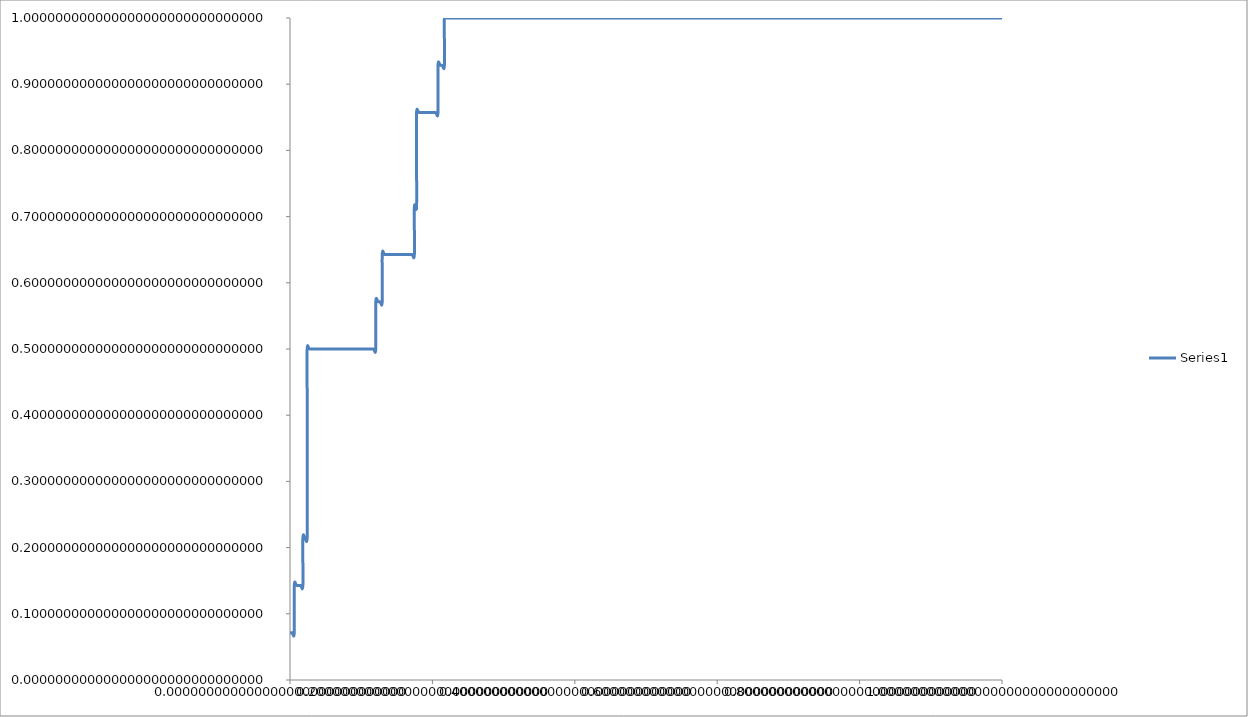
| Category | Series 0 |
|---|---|
| 0.0 | 0.071 |
| 0.003012048192771122 | 0.071 |
| 0.0060240963855421326 | 0.071 |
| 0.0060240963855421326 | 0.143 |
| 0.009036144578313254 | 0.143 |
| 0.012048192771084376 | 0.143 |
| 0.015060240963855387 | 0.143 |
| 0.01807228915662651 | 0.143 |
| 0.01807228915662651 | 0.214 |
| 0.02108433734939763 | 0.214 |
| 0.02409638554216864 | 0.214 |
| 0.02409638554216864 | 0.286 |
| 0.02409638554216864 | 0.357 |
| 0.02409638554216864 | 0.429 |
| 0.02409638554216864 | 0.5 |
| 0.027108433734939763 | 0.5 |
| 0.030120481927710885 | 0.5 |
| 0.033132530120481896 | 0.5 |
| 0.03614457831325302 | 0.5 |
| 0.03915662650602414 | 0.5 |
| 0.04216867469879515 | 0.5 |
| 0.04518072289156627 | 0.5 |
| 0.048192771084337394 | 0.5 |
| 0.051204819277108404 | 0.5 |
| 0.054216867469879526 | 0.5 |
| 0.05722891566265065 | 0.5 |
| 0.06024096385542166 | 0.5 |
| 0.06325301204819278 | 0.5 |
| 0.0662650602409639 | 0.5 |
| 0.06927710843373491 | 0.5 |
| 0.07228915662650603 | 0.5 |
| 0.07530120481927716 | 0.5 |
| 0.07831325301204817 | 0.5 |
| 0.08132530120481929 | 0.5 |
| 0.08433734939759041 | 0.5 |
| 0.08734939759036142 | 0.5 |
| 0.09036144578313254 | 0.5 |
| 0.09337349397590367 | 0.5 |
| 0.09638554216867468 | 0.5 |
| 0.0993975903614458 | 0.5 |
| 0.10240963855421692 | 0.5 |
| 0.10542168674698793 | 0.5 |
| 0.10843373493975905 | 0.5 |
| 0.11144578313253017 | 0.5 |
| 0.11445783132530118 | 0.5 |
| 0.1174698795180723 | 0.5 |
| 0.12048192771084343 | 0.5 |
| 0.12048192771084343 | 0.571 |
| 0.12349397590361444 | 0.571 |
| 0.12650602409638556 | 0.571 |
| 0.12951807228915657 | 0.571 |
| 0.12951807228915657 | 0.643 |
| 0.1325301204819277 | 0.643 |
| 0.13554216867469882 | 0.643 |
| 0.13855421686746983 | 0.643 |
| 0.14156626506024095 | 0.643 |
| 0.14457831325301207 | 0.643 |
| 0.14759036144578308 | 0.643 |
| 0.1506024096385542 | 0.643 |
| 0.15361445783132532 | 0.643 |
| 0.15662650602409633 | 0.643 |
| 0.15963855421686746 | 0.643 |
| 0.16265060240963858 | 0.643 |
| 0.1656626506024096 | 0.643 |
| 0.1686746987951807 | 0.643 |
| 0.17168674698795183 | 0.643 |
| 0.17469879518072284 | 0.643 |
| 0.17469879518072284 | 0.714 |
| 0.17771084337349397 | 0.714 |
| 0.17771084337349397 | 0.786 |
| 0.17771084337349397 | 0.857 |
| 0.1807228915662651 | 0.857 |
| 0.1837349397590361 | 0.857 |
| 0.18674698795180722 | 0.857 |
| 0.18975903614457834 | 0.857 |
| 0.19277108433734935 | 0.857 |
| 0.19578313253012047 | 0.857 |
| 0.1987951807228916 | 0.857 |
| 0.2018072289156626 | 0.857 |
| 0.20481927710843373 | 0.857 |
| 0.20783132530120485 | 0.857 |
| 0.20783132530120485 | 0.929 |
| 0.21084337349397586 | 0.929 |
| 0.21385542168674698 | 0.929 |
| 0.2168674698795181 | 0.929 |
| 0.2168674698795181 | 1 |
| 0.21987951807228912 | 1 |
| 0.22289156626506024 | 1 |
| 0.22590361445783136 | 1 |
| 0.22891566265060237 | 1 |
| 0.2319277108433735 | 1 |
| 0.2349397590361446 | 1 |
| 0.23795180722891562 | 1 |
| 0.24096385542168675 | 1 |
| 0.24397590361445787 | 1 |
| 0.24698795180722888 | 1 |
| 0.25 | 1 |
| 0.2530120481927711 | 1 |
| 0.25602409638554213 | 1 |
| 0.25903614457831325 | 1 |
| 0.2620481927710844 | 1 |
| 0.2650602409638554 | 1 |
| 0.2680722891566265 | 1 |
| 0.27108433734939763 | 1 |
| 0.27409638554216864 | 1 |
| 0.27710843373493976 | 1 |
| 0.2801204819277109 | 1 |
| 0.2831325301204819 | 1 |
| 0.286144578313253 | 1 |
| 0.28915662650602414 | 1 |
| 0.29216867469879515 | 1 |
| 0.29518072289156627 | 1 |
| 0.2981927710843374 | 1 |
| 0.3012048192771084 | 1 |
| 0.3042168674698795 | 1 |
| 0.30722891566265065 | 1 |
| 0.31024096385542166 | 1 |
| 0.3132530120481928 | 1 |
| 0.3162650602409639 | 1 |
| 0.3192771084337349 | 1 |
| 0.32228915662650603 | 1 |
| 0.32530120481927716 | 1 |
| 0.32831325301204817 | 1 |
| 0.3313253012048193 | 1 |
| 0.3343373493975904 | 1 |
| 0.3373493975903614 | 1 |
| 0.34036144578313254 | 1 |
| 0.34337349397590367 | 1 |
| 0.3463855421686747 | 1 |
| 0.3493975903614458 | 1 |
| 0.3524096385542169 | 1 |
| 0.35542168674698793 | 1 |
| 0.35843373493975905 | 1 |
| 0.3614457831325302 | 1 |
| 0.3644578313253012 | 1 |
| 0.3674698795180723 | 1 |
| 0.37048192771084343 | 1 |
| 0.37349397590361444 | 1 |
| 0.37650602409638556 | 1 |
| 0.37951807228915657 | 1 |
| 0.3825301204819277 | 1 |
| 0.3855421686746988 | 1 |
| 0.3885542168674698 | 1 |
| 0.39156626506024095 | 1 |
| 0.39457831325301207 | 1 |
| 0.3975903614457831 | 1 |
| 0.4006024096385542 | 1 |
| 0.4036144578313253 | 1 |
| 0.40662650602409633 | 1 |
| 0.40963855421686746 | 1 |
| 0.4126506024096386 | 1 |
| 0.4156626506024096 | 1 |
| 0.4186746987951807 | 1 |
| 0.42168674698795183 | 1 |
| 0.42469879518072284 | 1 |
| 0.42771084337349397 | 1 |
| 0.4307228915662651 | 1 |
| 0.4337349397590361 | 1 |
| 0.4367469879518072 | 1 |
| 0.43975903614457834 | 1 |
| 0.44277108433734935 | 1 |
| 0.4457831325301205 | 1 |
| 0.4487951807228916 | 1 |
| 0.4518072289156626 | 1 |
| 0.45481927710843373 | 1 |
| 0.45783132530120485 | 1 |
| 0.46084337349397586 | 1 |
| 0.463855421686747 | 1 |
| 0.4668674698795181 | 1 |
| 0.4698795180722891 | 1 |
| 0.47289156626506024 | 1 |
| 0.47590361445783136 | 1 |
| 0.47891566265060237 | 1 |
| 0.4819277108433735 | 1 |
| 0.4849397590361446 | 1 |
| 0.4879518072289156 | 1 |
| 0.49096385542168675 | 1 |
| 0.49397590361445787 | 1 |
| 0.4969879518072289 | 1 |
| 0.5 | 1 |
| 0.5030120481927711 | 1 |
| 0.5060240963855422 | 1 |
| 0.5090361445783133 | 1 |
| 0.5120481927710843 | 1 |
| 0.5150602409638554 | 1 |
| 0.5180722891566265 | 1 |
| 0.5210843373493976 | 1 |
| 0.5240963855421688 | 1 |
| 0.5271084337349398 | 1 |
| 0.5301204819277108 | 1 |
| 0.5331325301204819 | 1 |
| 0.536144578313253 | 1 |
| 0.5391566265060241 | 1 |
| 0.5421686746987953 | 1 |
| 0.5451807228915663 | 1 |
| 0.5481927710843373 | 1 |
| 0.5512048192771084 | 1 |
| 0.5542168674698795 | 1 |
| 0.5572289156626506 | 1 |
| 0.5602409638554218 | 1 |
| 0.5632530120481928 | 1 |
| 0.5662650602409638 | 1 |
| 0.5692771084337349 | 1 |
| 0.572289156626506 | 1 |
| 0.5753012048192772 | 1 |
| 0.5783132530120482 | 1 |
| 0.5813253012048193 | 1 |
| 0.5843373493975903 | 1 |
| 0.5873493975903614 | 1 |
| 0.5903614457831325 | 1 |
| 0.5933734939759037 | 1 |
| 0.5963855421686747 | 1 |
| 0.5993975903614458 | 1 |
| 0.6024096385542168 | 1 |
| 0.6054216867469879 | 1 |
| 0.608433734939759 | 1 |
| 0.6114457831325302 | 1 |
| 0.6144578313253012 | 1 |
| 0.6174698795180723 | 1 |
| 0.6204819277108433 | 1 |
| 0.6234939759036144 | 1 |
| 0.6265060240963856 | 1 |
| 0.6295180722891567 | 1 |
| 0.6325301204819277 | 1 |
| 0.6355421686746988 | 1 |
| 0.6385542168674698 | 1 |
| 0.641566265060241 | 1 |
| 0.6445783132530121 | 1 |
| 0.6475903614457832 | 1 |
| 0.6506024096385542 | 1 |
| 0.6536144578313253 | 1 |
| 0.6566265060240963 | 1 |
| 0.6596385542168675 | 1 |
| 0.6626506024096386 | 1 |
| 0.6656626506024097 | 1 |
| 0.6686746987951807 | 1 |
| 0.6716867469879518 | 1 |
| 0.6746987951807228 | 1 |
| 0.677710843373494 | 1 |
| 0.6807228915662651 | 1 |
| 0.6837349397590362 | 1 |
| 0.6867469879518072 | 1 |
| 0.6897590361445782 | 1 |
| 0.6927710843373494 | 1 |
| 0.6957831325301205 | 1 |
| 0.6987951807228916 | 1 |
| 0.7018072289156627 | 1 |
| 0.7048192771084337 | 1 |
| 0.7078313253012047 | 1 |
| 0.7108433734939759 | 1 |
| 0.713855421686747 | 1 |
| 0.7168674698795181 | 1 |
| 0.7198795180722892 | 1 |
| 0.7228915662650602 | 1 |
| 0.7259036144578312 | 1 |
| 0.7289156626506024 | 1 |
| 0.7319277108433735 | 1 |
| 0.7349397590361446 | 1 |
| 0.7379518072289157 | 1 |
| 0.7409638554216867 | 1 |
| 0.7439759036144578 | 1 |
| 0.7469879518072289 | 1 |
| 0.75 | 1 |
| 0.7530120481927711 | 1 |
| 0.7560240963855421 | 1 |
| 0.7590361445783133 | 1 |
| 0.7620481927710844 | 1 |
| 0.7650602409638554 | 1 |
| 0.7680722891566265 | 1 |
| 0.7710843373493976 | 1 |
| 0.7740963855421686 | 1 |
| 0.7771084337349398 | 1 |
| 0.7801204819277109 | 1 |
| 0.7831325301204819 | 1 |
| 0.786144578313253 | 1 |
| 0.7891566265060241 | 1 |
| 0.7921686746987951 | 1 |
| 0.7951807228915663 | 1 |
| 0.7981927710843373 | 1 |
| 0.8012048192771084 | 1 |
| 0.8042168674698795 | 1 |
| 0.8072289156626506 | 1 |
| 0.8102409638554217 | 1 |
| 0.8132530120481928 | 1 |
| 0.8162650602409638 | 1 |
| 0.8192771084337349 | 1 |
| 0.822289156626506 | 1 |
| 0.8253012048192772 | 1 |
| 0.8283132530120482 | 1 |
| 0.8313253012048193 | 1 |
| 0.8343373493975903 | 1 |
| 0.8373493975903614 | 1 |
| 0.8403614457831325 | 1 |
| 0.8433734939759037 | 1 |
| 0.8463855421686747 | 1 |
| 0.8493975903614458 | 1 |
| 0.8524096385542168 | 1 |
| 0.8554216867469879 | 1 |
| 0.858433734939759 | 1 |
| 0.8614457831325302 | 1 |
| 0.8644578313253012 | 1 |
| 0.8674698795180723 | 1 |
| 0.8704819277108433 | 1 |
| 0.8734939759036144 | 1 |
| 0.8765060240963856 | 1 |
| 0.8795180722891567 | 1 |
| 0.8825301204819277 | 1 |
| 0.8855421686746988 | 1 |
| 0.8885542168674698 | 1 |
| 0.891566265060241 | 1 |
| 0.8945783132530121 | 1 |
| 0.8975903614457832 | 1 |
| 0.9006024096385542 | 1 |
| 0.9036144578313253 | 1 |
| 0.9066265060240963 | 1 |
| 0.9096385542168675 | 1 |
| 0.9126506024096386 | 1 |
| 0.9156626506024097 | 1 |
| 0.9186746987951807 | 1 |
| 0.9216867469879518 | 1 |
| 0.9246987951807228 | 1 |
| 0.927710843373494 | 1 |
| 0.9307228915662651 | 1 |
| 0.9337349397590361 | 1 |
| 0.9367469879518072 | 1 |
| 0.9397590361445783 | 1 |
| 0.9427710843373494 | 1 |
| 0.9457831325301205 | 1 |
| 0.9487951807228916 | 1 |
| 0.9518072289156626 | 1 |
| 0.9548192771084337 | 1 |
| 0.9578313253012049 | 1 |
| 0.9608433734939759 | 1 |
| 0.963855421686747 | 1 |
| 0.9668674698795181 | 1 |
| 0.9698795180722891 | 1 |
| 0.9728915662650602 | 1 |
| 0.9759036144578314 | 1 |
| 0.9789156626506024 | 1 |
| 0.9819277108433735 | 1 |
| 0.9849397590361446 | 1 |
| 0.9879518072289156 | 1 |
| 0.9909638554216867 | 1 |
| 0.9939759036144579 | 1 |
| 0.9969879518072289 | 1 |
| 1.0 | 1 |